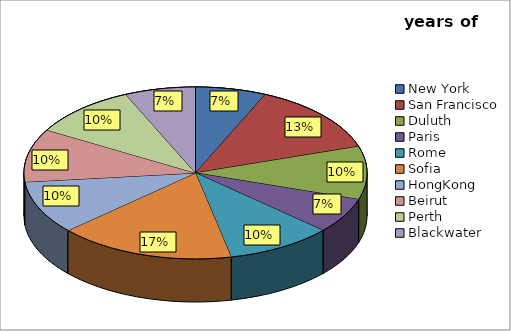
| Category | years of stay |
|---|---|
| New York | 2 |
| San Francisco | 4 |
| Duluth | 3 |
| Paris | 2 |
| Rome | 3 |
| Sofia | 5 |
| HongKong | 3 |
| Beirut | 3 |
| Perth | 3 |
| Blackwater | 2 |